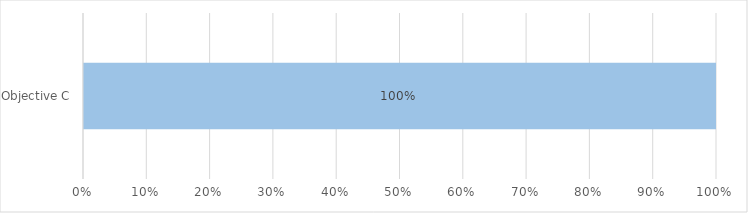
| Category | Not yet assessed | Not Relevant | Not achieved | Partially Achieved | Achieved |
|---|---|---|---|---|---|
| Objective C | 1 | 0 | 0 | 0 | 0 |